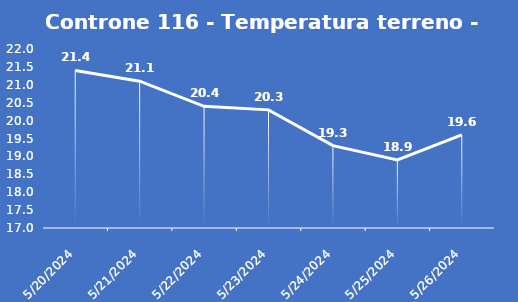
| Category | Controne 116 - Temperatura terreno - Grezzo (°C) |
|---|---|
| 5/20/24 | 21.4 |
| 5/21/24 | 21.1 |
| 5/22/24 | 20.4 |
| 5/23/24 | 20.3 |
| 5/24/24 | 19.3 |
| 5/25/24 | 18.9 |
| 5/26/24 | 19.6 |